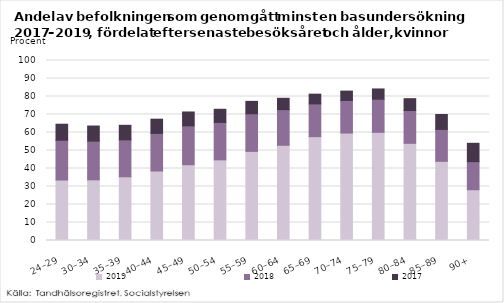
| Category | 2019 | 2018 | 2017 |
|---|---|---|---|
| 24–29 | 33.6 | 22.1 | 8.9 |
| 30–34 | 33.7 | 21.5 | 8.4 |
| 35–39 | 35.4 | 20.5 | 8.1 |
| 40–44 | 38.6 | 20.9 | 7.9 |
| 45–49 | 42.1 | 21.6 | 7.7 |
| 50–54 | 44.8 | 20.8 | 7.3 |
| 55–59 | 49.5 | 20.9 | 6.9 |
| 60–64 | 52.9 | 19.8 | 6.3 |
| 65–69 | 57.7 | 18.2 | 5.4 |
| 70–74 | 59.7 | 18.1 | 5.2 |
| 75–79 | 60.1 | 18.4 | 5.7 |
| 80–84 | 54 | 18.2 | 6.6 |
| 85–89 | 44 | 17.7 | 8.3 |
| 90+ | 28.2 | 15.6 | 10.2 |